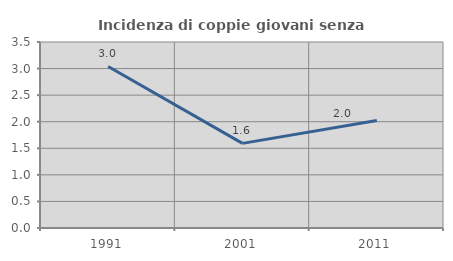
| Category | Incidenza di coppie giovani senza figli |
|---|---|
| 1991.0 | 3.04 |
| 2001.0 | 1.593 |
| 2011.0 | 2.025 |